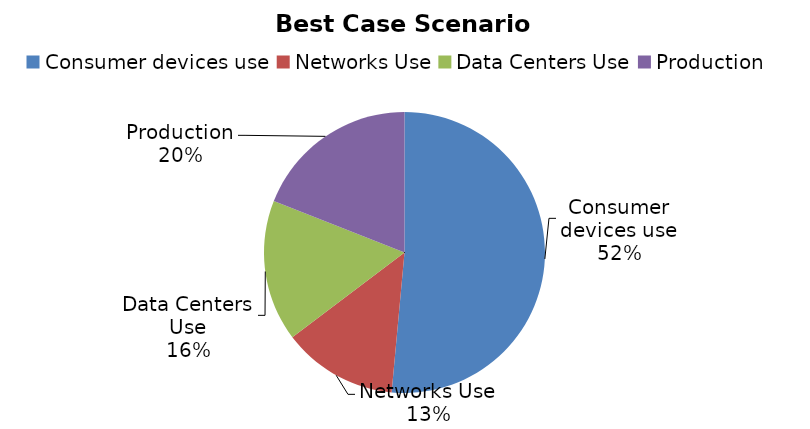
| Category | Series 0 |
|---|---|
| Consumer devices use | 619.83 |
| Networks Use | 159.507 |
| Data Centers Use | 195.989 |
| Production | 229.09 |